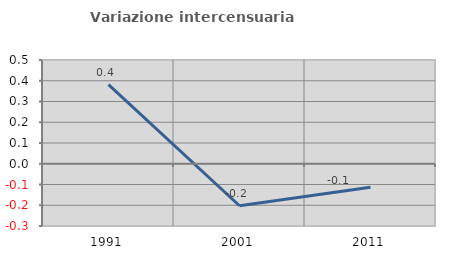
| Category | Variazione intercensuaria annua |
|---|---|
| 1991.0 | 0.381 |
| 2001.0 | -0.202 |
| 2011.0 | -0.113 |